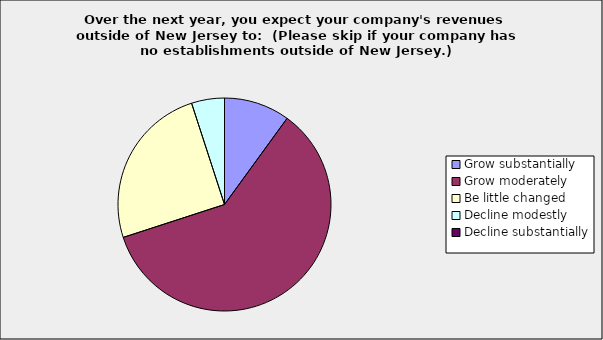
| Category | Series 0 |
|---|---|
| Grow substantially | 0.1 |
| Grow moderately | 0.6 |
| Be little changed | 0.25 |
| Decline modestly | 0.05 |
| Decline substantially | 0 |